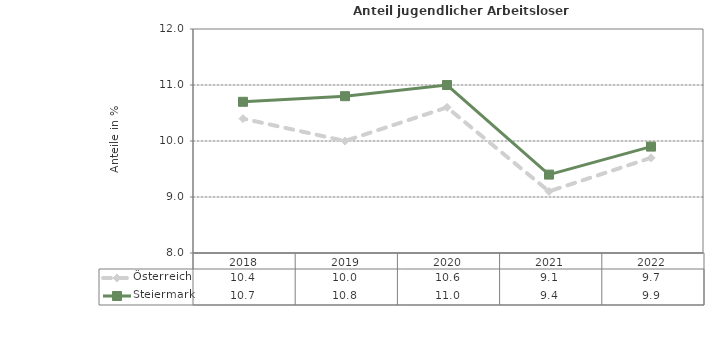
| Category | Österreich | Steiermark |
|---|---|---|
| 2022.0 | 9.7 | 9.9 |
| 2021.0 | 9.1 | 9.4 |
| 2020.0 | 10.6 | 11 |
| 2019.0 | 10 | 10.8 |
| 2018.0 | 10.4 | 10.7 |